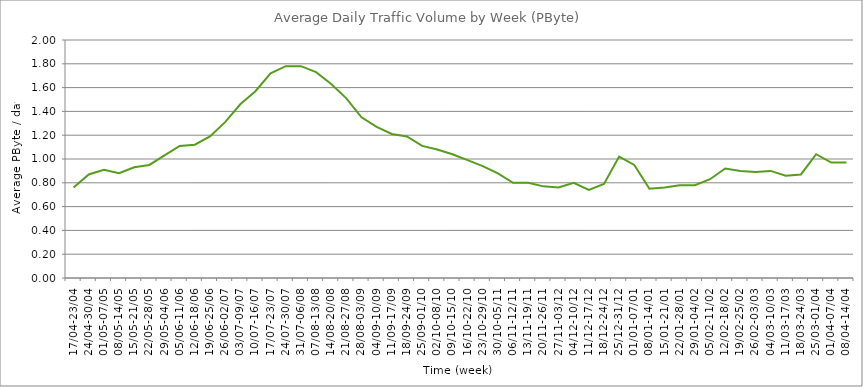
| Category | Average |
|---|---|
| 17/04-23/04 | 0.76 |
| 24/04-30/04 | 0.87 |
| 01/05-07/05 | 0.91 |
| 08/05-14/05 | 0.88 |
| 15/05-21/05 | 0.93 |
| 22/05-28/05 | 0.95 |
| 29/05-04/06 | 1.03 |
| 05/06-11/06 | 1.11 |
| 12/06-18/06 | 1.12 |
| 19/06-25/06 | 1.19 |
| 26/06-02/07 | 1.31 |
| 03/07-09/07 | 1.46 |
| 10/07-16/07 | 1.57 |
| 17/07-23/07 | 1.72 |
| 24/07-30/07 | 1.78 |
| 31/07-06/08 | 1.78 |
| 07/08-13/08 | 1.73 |
| 14/08-20/08 | 1.63 |
| 21/08-27/08 | 1.51 |
| 28/08-03/09 | 1.35 |
| 04/09-10/09 | 1.27 |
| 11/09-17/09 | 1.21 |
| 18/09-24/09 | 1.19 |
| 25/09-01/10 | 1.11 |
| 02/10-08/10 | 1.08 |
| 09/10-15/10 | 1.04 |
| 16/10-22/10 | 0.99 |
| 23/10-29/10 | 0.94 |
| 30/10-05/11 | 0.88 |
| 06/11-12/11 | 0.8 |
| 13/11-19/11 | 0.8 |
| 20/11-26/11 | 0.77 |
| 27/11-03/12 | 0.76 |
| 04/12-10/12 | 0.8 |
| 11/12-17/12 | 0.74 |
| 18/12-24/12 | 0.79 |
| 25/12-31/12 | 1.02 |
| 01/01-07/01 | 0.95 |
| 08/01-14/01 | 0.75 |
| 15/01-21/01 | 0.76 |
| 22/01-28/01 | 0.78 |
| 29/01-04/02 | 0.78 |
| 05/02-11/02 | 0.83 |
| 12/02-18/02 | 0.92 |
| 19/02-25/02 | 0.9 |
| 26/02-03/03 | 0.89 |
| 04/03-10/03 | 0.9 |
| 11/03-17/03 | 0.86 |
| 18/03-24/03 | 0.87 |
| 25/03-01/04 | 1.04 |
| 01/04-07/04 | 0.97 |
| 08/04-14/04 | 0.97 |